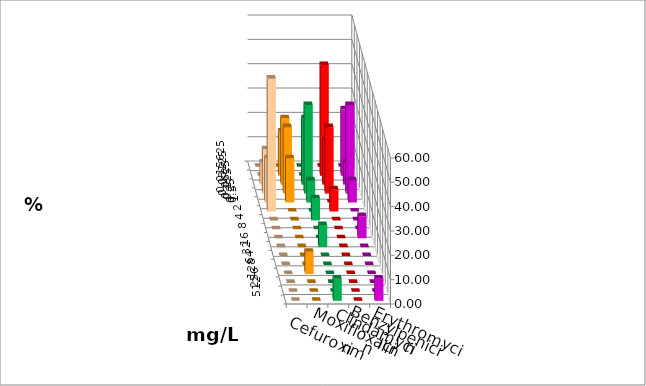
| Category | Cefuroxim | Moxifloxacin | Clindamycin | Benzylpenicillin | Erythromycin |
|---|---|---|---|---|---|
| 0.015625 | 0 | 0 | 0 | 0 | 0 |
| 0.03125 | 0 | 18.182 | 0 | 45.455 | 27.273 |
| 0.0625 | 9.091 | 27.273 | 27.273 | 18.182 | 9.091 |
| 0.125 | 18.182 | 27.273 | 36.364 | 27.273 | 36.364 |
| 0.25 | 18.182 | 18.182 | 9.091 | 0 | 9.091 |
| 0.5 | 54.545 | 0 | 0 | 9.091 | 0 |
| 1.0 | 0 | 0 | 9.091 | 0 | 0 |
| 2.0 | 0 | 0 | 0 | 0 | 0 |
| 4.0 | 0 | 0 | 0 | 0 | 9.091 |
| 8.0 | 0 | 0 | 9.091 | 0 | 0 |
| 16.0 | 0 | 0 | 0 | 0 | 0 |
| 32.0 | 0 | 0 | 0 | 0 | 0 |
| 64.0 | 0 | 9.091 | 0 | 0 | 0 |
| 128.0 | 0 | 0 | 0 | 0 | 0 |
| 256.0 | 0 | 0 | 0 | 0 | 0 |
| 512.0 | 0 | 0 | 9.091 | 0 | 9.091 |